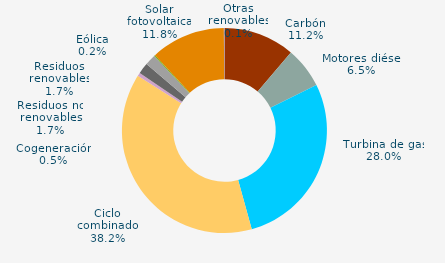
| Category | Series 0 |
|---|---|
| Carbón | 11.21 |
| Motores diésel | 6.479 |
| Turbina de gas | 28.029 |
| Ciclo combinado | 38.244 |
| Generación auxiliar | 0 |
| Cogeneración | 0.536 |
| Residuos no renovables | 1.738 |
| Residuos renovables | 1.738 |
| Eólica | 0.166 |
| Solar fotovoltaica | 11.762 |
| Otras renovables | 0.099 |